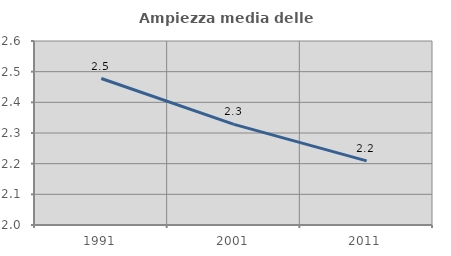
| Category | Ampiezza media delle famiglie |
|---|---|
| 1991.0 | 2.478 |
| 2001.0 | 2.328 |
| 2011.0 | 2.209 |